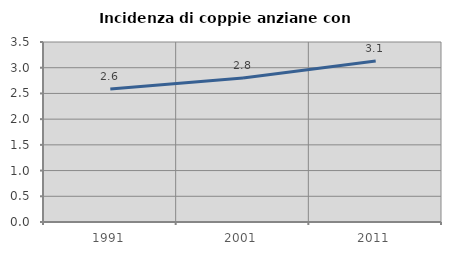
| Category | Incidenza di coppie anziane con figli |
|---|---|
| 1991.0 | 2.588 |
| 2001.0 | 2.799 |
| 2011.0 | 3.129 |